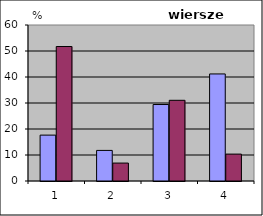
| Category | Series 0 | Series 1 |
|---|---|---|
| 0 | 17.647 | 51.724 |
| 1 | 11.765 | 6.897 |
| 2 | 29.412 | 31.034 |
| 3 | 41.176 | 10.345 |